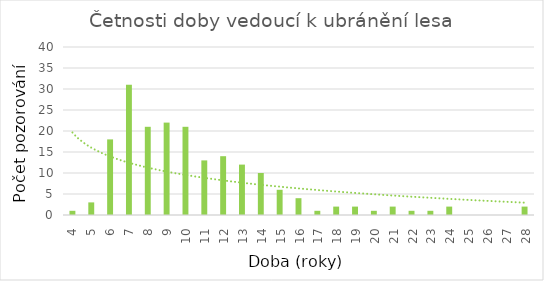
| Category | Četnosti doby |
|---|---|
| 4.0 | 1 |
| 5.0 | 3 |
| 6.0 | 18 |
| 7.0 | 31 |
| 8.0 | 21 |
| 9.0 | 22 |
| 10.0 | 21 |
| 11.0 | 13 |
| 12.0 | 14 |
| 13.0 | 12 |
| 14.0 | 10 |
| 15.0 | 6 |
| 16.0 | 4 |
| 17.0 | 1 |
| 18.0 | 2 |
| 19.0 | 2 |
| 20.0 | 1 |
| 21.0 | 2 |
| 22.0 | 1 |
| 23.0 | 1 |
| 24.0 | 2 |
| 25.0 | 0 |
| 26.0 | 0 |
| 27.0 | 0 |
| 28.0 | 2 |